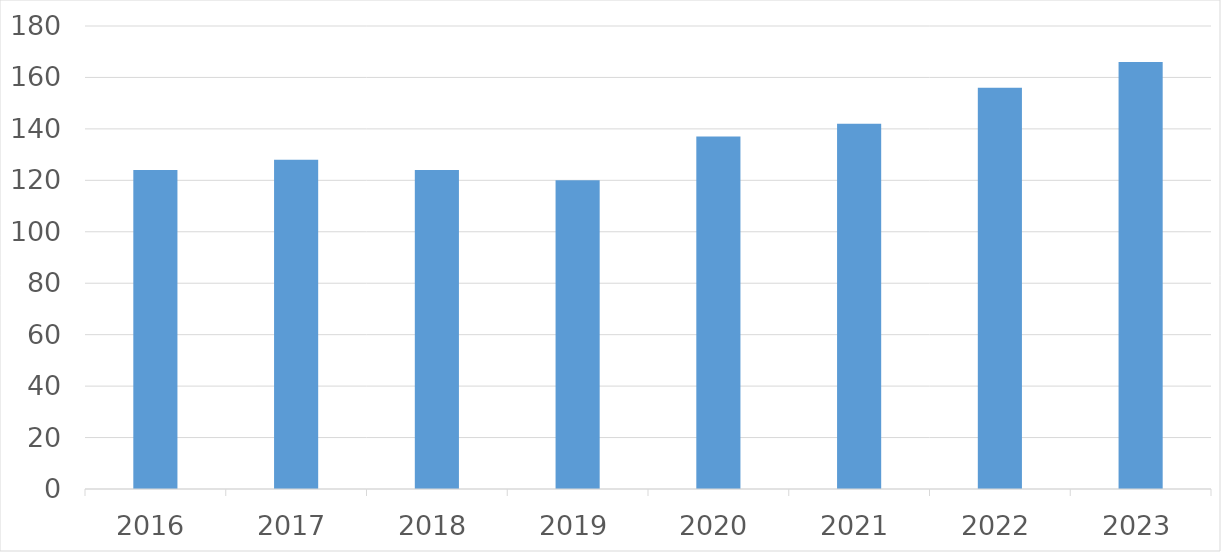
| Category | Series 0 |
|---|---|
| 2016 | 124 |
| 2017 | 128 |
| 2018 | 124 |
| 2019 | 120 |
| 2020 | 137 |
| 2021 | 142 |
| 2022 | 156 |
| 2023 | 166 |